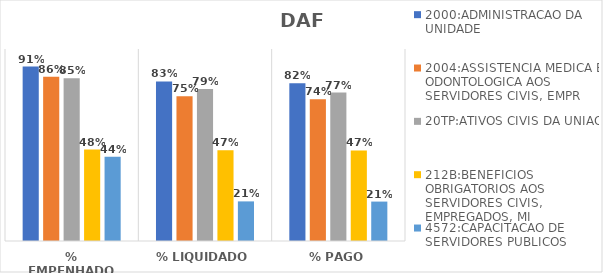
| Category | 2000:ADMINISTRACAO DA UNIDADE | 2004:ASSISTENCIA MEDICA E ODONTOLOGICA AOS SERVIDORES CIVIS, EMPR | 20TP:ATIVOS CIVIS DA UNIAO | 212B:BENEFICIOS OBRIGATORIOS AOS SERVIDORES CIVIS, EMPREGADOS, MI | 4572:CAPACITACAO DE SERVIDORES PUBLICOS FEDERAIS EM PROCESSO DE Q |
|---|---|---|---|---|---|
| % EMPENHADO | 0.908 | 0.856 | 0.848 | 0.476 | 0.439 |
| % LIQUIDADO | 0.831 | 0.753 | 0.792 | 0.472 | 0.206 |
| % PAGO | 0.821 | 0.739 | 0.773 | 0.472 | 0.205 |